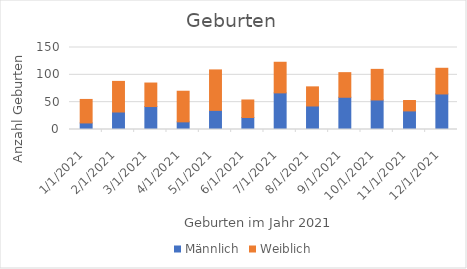
| Category | Männlich | Weiblich |
|---|---|---|
| 1/1/21 | 12 | 43 |
| 2/1/21 | 32 | 56 |
| 3/1/21 | 42 | 43 |
| 4/1/21 | 14 | 56 |
| 5/1/21 | 35 | 74 |
| 6/1/21 | 22 | 32 |
| 7/1/21 | 67 | 56 |
| 8/1/21 | 43 | 35 |
| 9/1/21 | 59 | 45 |
| 10/1/21 | 54 | 56 |
| 11/1/21 | 34 | 19 |
| 12/1/21 | 65 | 47 |